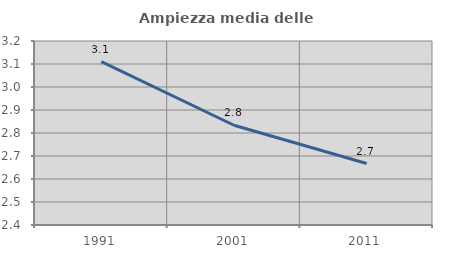
| Category | Ampiezza media delle famiglie |
|---|---|
| 1991.0 | 3.11 |
| 2001.0 | 2.834 |
| 2011.0 | 2.667 |